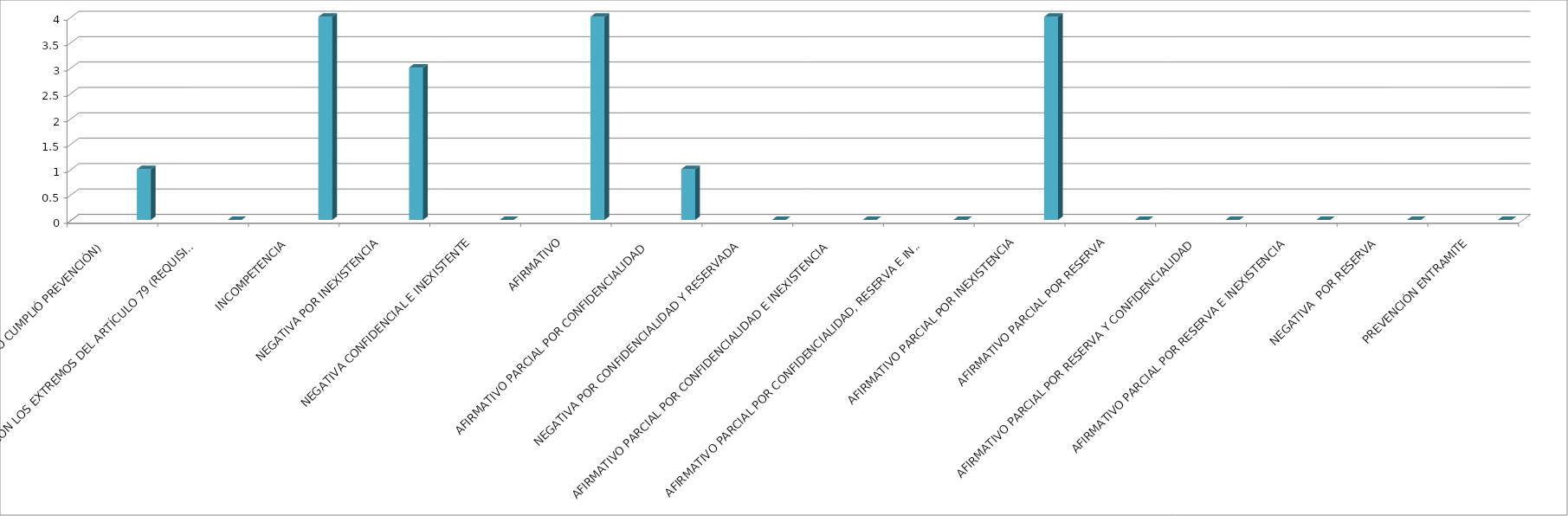
| Category | Series 0 | Series 1 | Series 2 | Series 3 | Series 4 |
|---|---|---|---|---|---|
| SE TIENE POR NO PRESENTADA ( NO CUMPLIÓ PREVENCIÓN) |  |  |  |  | 1 |
| NO CUMPLIO CON LOS EXTREMOS DEL ARTÍCULO 79 (REQUISITOS) |  |  |  |  | 0 |
| INCOMPETENCIA  |  |  |  |  | 4 |
| NEGATIVA POR INEXISTENCIA |  |  |  |  | 3 |
| NEGATIVA CONFIDENCIAL E INEXISTENTE |  |  |  |  | 0 |
| AFIRMATIVO |  |  |  |  | 4 |
| AFIRMATIVO PARCIAL POR CONFIDENCIALIDAD  |  |  |  |  | 1 |
| NEGATIVA POR CONFIDENCIALIDAD Y RESERVADA |  |  |  |  | 0 |
| AFIRMATIVO PARCIAL POR CONFIDENCIALIDAD E INEXISTENCIA |  |  |  |  | 0 |
| AFIRMATIVO PARCIAL POR CONFIDENCIALIDAD, RESERVA E INEXISTENCIA |  |  |  |  | 0 |
| AFIRMATIVO PARCIAL POR INEXISTENCIA |  |  |  |  | 4 |
| AFIRMATIVO PARCIAL POR RESERVA |  |  |  |  | 0 |
| AFIRMATIVO PARCIAL POR RESERVA Y CONFIDENCIALIDAD |  |  |  |  | 0 |
| AFIRMATIVO PARCIAL POR RESERVA E INEXISTENCIA |  |  |  |  | 0 |
| NEGATIVA  POR RESERVA |  |  |  |  | 0 |
| PREVENCIÓN ENTRAMITE |  |  |  |  | 0 |